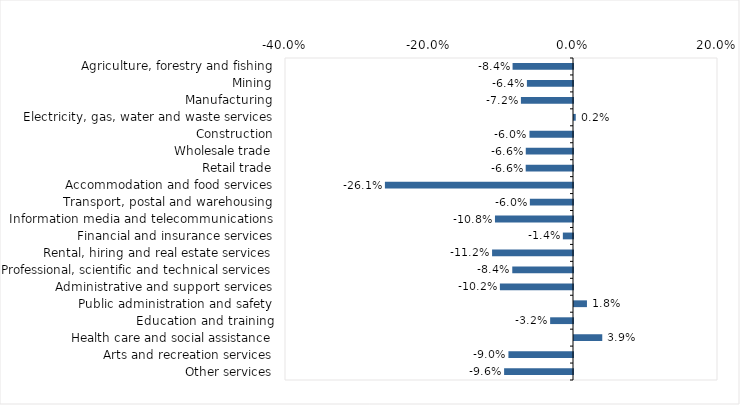
| Category | This week |
|---|---|
| Agriculture, forestry and fishing | -0.084 |
| Mining | -0.064 |
| Manufacturing | -0.072 |
| Electricity, gas, water and waste services | 0.002 |
| Construction | -0.06 |
| Wholesale trade | -0.066 |
| Retail trade | -0.066 |
| Accommodation and food services | -0.261 |
| Transport, postal and warehousing | -0.06 |
| Information media and telecommunications | -0.108 |
| Financial and insurance services | -0.014 |
| Rental, hiring and real estate services | -0.112 |
| Professional, scientific and technical services | -0.084 |
| Administrative and support services | -0.102 |
| Public administration and safety | 0.018 |
| Education and training | -0.032 |
| Health care and social assistance | 0.039 |
| Arts and recreation services | -0.09 |
| Other services | -0.096 |